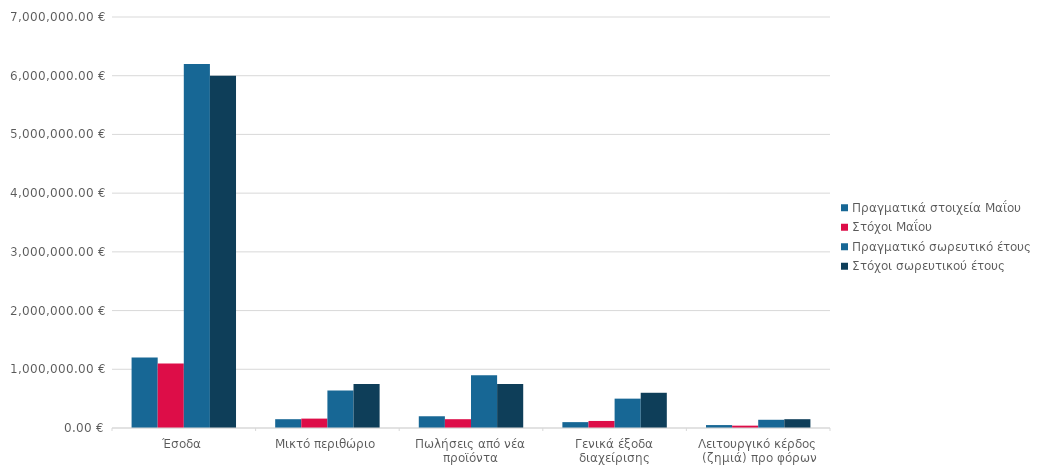
| Category | Πραγματικά στοιχεία Μαΐου | Στόχοι Μαΐου | Πραγματικό σωρευτικό έτους | Στόχοι σωρευτικού έτους |
|---|---|---|---|---|
| Έσοδα | 1200000 | 1100000 | 6200000 | 6000000 |
| Μικτό περιθώριο | 150000 | 160000 | 640000 | 750000 |
| Πωλήσεις από νέα προϊόντα | 200000 | 150000 | 900000 | 750000 |
| Γενικά έξοδα διαχείρισης | 100000 | 120000 | 500000 | 600000 |
| Λειτουργικό κέρδος (ζημιά) προ φόρων | 50000 | 40000 | 140000 | 150000 |